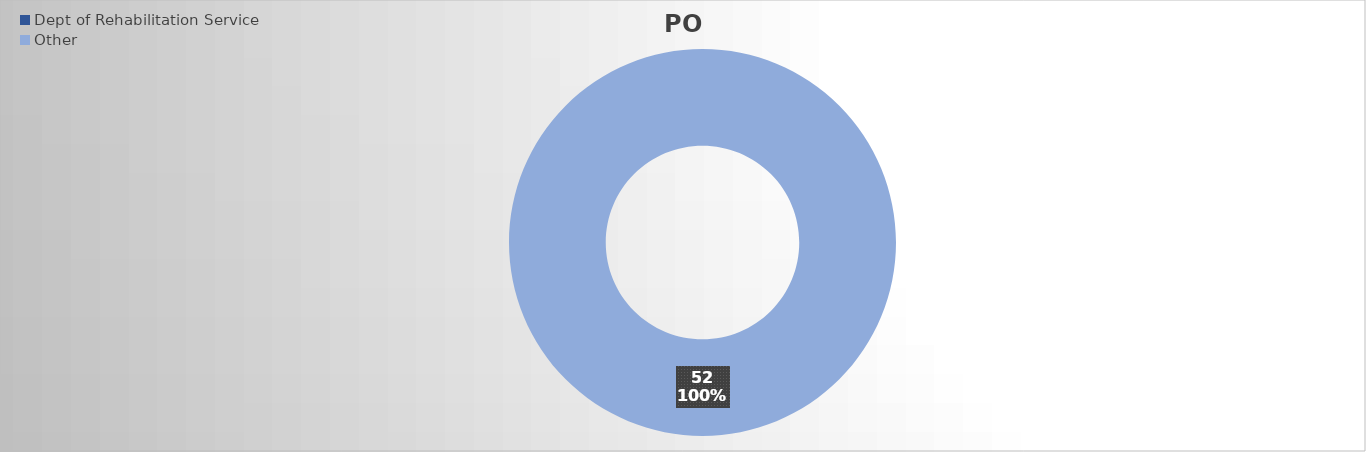
| Category | PO Lines |
|---|---|
| Dept of Rehabilitation Service | 0 |
| Other | 52 |